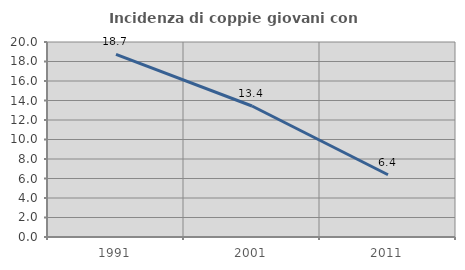
| Category | Incidenza di coppie giovani con figli |
|---|---|
| 1991.0 | 18.73 |
| 2001.0 | 13.438 |
| 2011.0 | 6.383 |